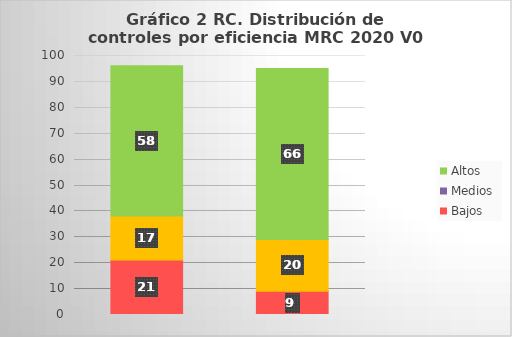
| Category | Bajos | Medios | Altos |
|---|---|---|---|
| 0 | 21 | 17 | 58 |
| 1 | 9 | 20 | 66 |